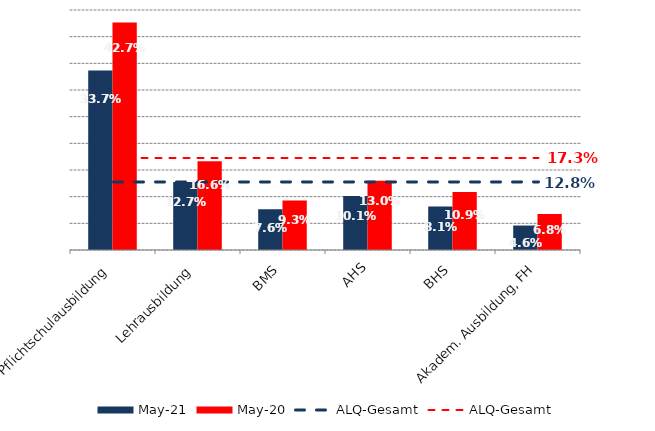
| Category | Mai 21 | Mai 20 |
|---|---|---|
| Pflichtschulausbildung | 0.337 | 0.427 |
| Lehrausbildung | 0.127 | 0.166 |
| BMS | 0.076 | 0.093 |
| AHS | 0.101 | 0.13 |
| BHS | 0.081 | 0.109 |
| Akadem. Ausbildung, FH | 0.046 | 0.068 |